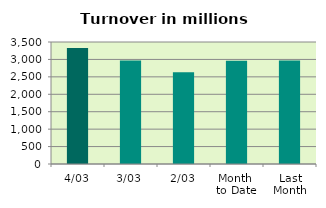
| Category | Series 0 |
|---|---|
| 4/03 | 3330.104 |
| 3/03 | 2969.08 |
| 2/03 | 2635.352 |
| Month 
to Date | 2961.414 |
| Last
Month | 2972.107 |